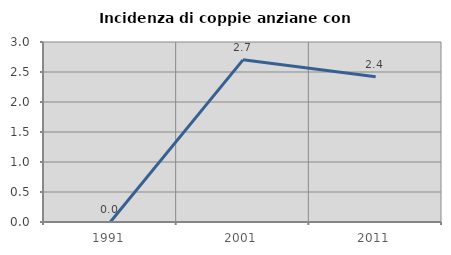
| Category | Incidenza di coppie anziane con figli |
|---|---|
| 1991.0 | 0 |
| 2001.0 | 2.703 |
| 2011.0 | 2.419 |